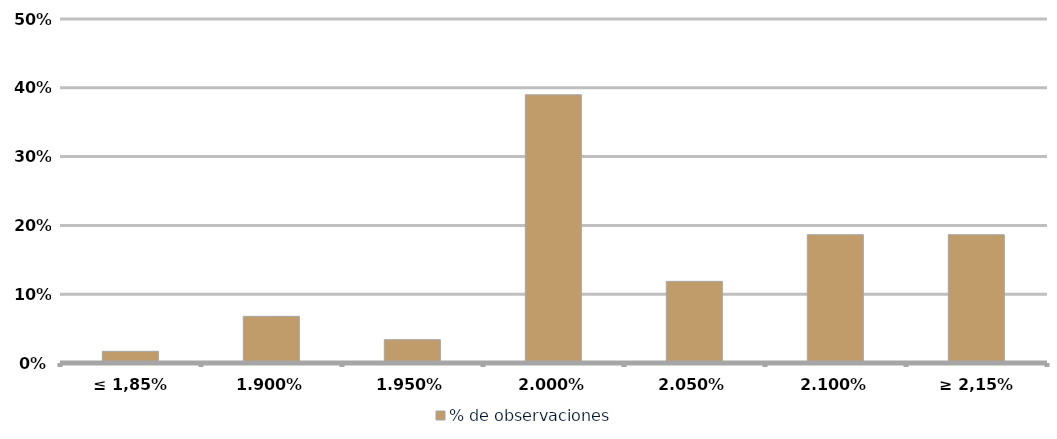
| Category | % de observaciones  |
|---|---|
| ≤ 1,85% | 0.017 |
| 1,90% | 0.068 |
| 1,95% | 0.034 |
| 2,00% | 0.39 |
| 2,05% | 0.119 |
| 2,10% | 0.186 |
| ≥ 2,15% | 0.186 |